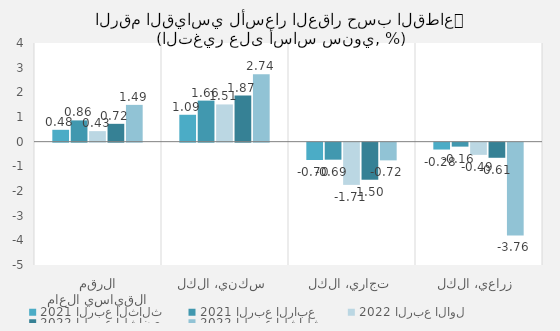
| Category | 2021 | 2022 |
|---|---|---|
| الرقم القياسي العام | 0.862 | 1.492 |
| سكني، الكل | 1.664 | 2.735 |
| تجاري، الكل | -0.69 | -0.717 |
| زراعي، الكل | -0.161 | -3.763 |